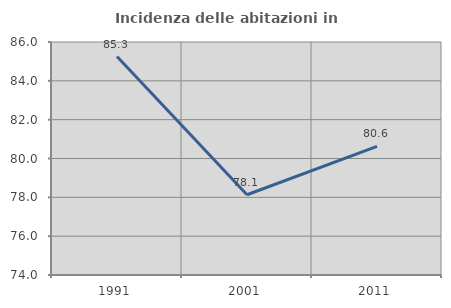
| Category | Incidenza delle abitazioni in proprietà  |
|---|---|
| 1991.0 | 85.251 |
| 2001.0 | 78.133 |
| 2011.0 | 80.628 |